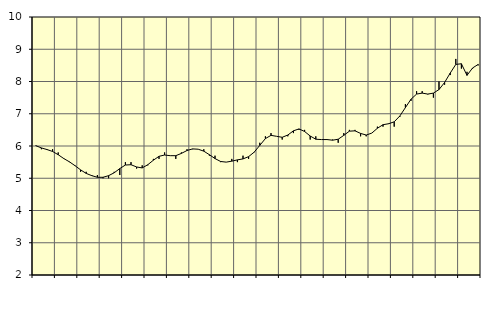
| Category | Piggar | Information och kommunikation, SNI 58-63 |
|---|---|---|
| nan | 6 | 6.01 |
| 1.0 | 5.9 | 5.94 |
| 1.0 | 5.9 | 5.89 |
| 1.0 | 5.9 | 5.83 |
| nan | 5.8 | 5.73 |
| 2.0 | 5.6 | 5.61 |
| 2.0 | 5.5 | 5.51 |
| 2.0 | 5.4 | 5.39 |
| nan | 5.2 | 5.26 |
| 3.0 | 5.2 | 5.15 |
| 3.0 | 5.1 | 5.08 |
| 3.0 | 5.1 | 5.03 |
| nan | 5 | 5.03 |
| 4.0 | 5 | 5.08 |
| 4.0 | 5.2 | 5.17 |
| 4.0 | 5.1 | 5.3 |
| nan | 5.5 | 5.41 |
| 5.0 | 5.5 | 5.42 |
| 5.0 | 5.3 | 5.35 |
| 5.0 | 5.4 | 5.32 |
| nan | 5.4 | 5.42 |
| 6.0 | 5.6 | 5.56 |
| 6.0 | 5.6 | 5.68 |
| 6.0 | 5.8 | 5.72 |
| nan | 5.7 | 5.7 |
| 7.0 | 5.6 | 5.7 |
| 7.0 | 5.8 | 5.77 |
| 7.0 | 5.9 | 5.86 |
| nan | 5.9 | 5.91 |
| 8.0 | 5.9 | 5.9 |
| 8.0 | 5.9 | 5.84 |
| 8.0 | 5.7 | 5.73 |
| nan | 5.7 | 5.61 |
| 9.0 | 5.5 | 5.52 |
| 9.0 | 5.5 | 5.5 |
| 9.0 | 5.6 | 5.53 |
| nan | 5.5 | 5.57 |
| 10.0 | 5.7 | 5.6 |
| 10.0 | 5.6 | 5.67 |
| 10.0 | 5.8 | 5.81 |
| nan | 6.1 | 6.02 |
| 11.0 | 6.3 | 6.23 |
| 11.0 | 6.4 | 6.33 |
| 11.0 | 6.3 | 6.3 |
| nan | 6.2 | 6.27 |
| 12.0 | 6.3 | 6.34 |
| 12.0 | 6.4 | 6.47 |
| 12.0 | 6.5 | 6.53 |
| nan | 6.5 | 6.45 |
| 13.0 | 6.2 | 6.31 |
| 13.0 | 6.3 | 6.21 |
| 13.0 | 6.2 | 6.2 |
| nan | 6.2 | 6.2 |
| 14.0 | 6.2 | 6.18 |
| 14.0 | 6.1 | 6.21 |
| 14.0 | 6.4 | 6.33 |
| nan | 6.5 | 6.46 |
| 15.0 | 6.5 | 6.47 |
| 15.0 | 6.3 | 6.39 |
| 15.0 | 6.3 | 6.34 |
| nan | 6.4 | 6.4 |
| 16.0 | 6.6 | 6.55 |
| 16.0 | 6.6 | 6.66 |
| 16.0 | 6.7 | 6.69 |
| nan | 6.6 | 6.75 |
| 17.0 | 6.9 | 6.93 |
| 17.0 | 7.3 | 7.19 |
| 17.0 | 7.4 | 7.45 |
| nan | 7.7 | 7.61 |
| 18.0 | 7.7 | 7.64 |
| 18.0 | 7.6 | 7.61 |
| 18.0 | 7.5 | 7.64 |
| nan | 8 | 7.75 |
| 19.0 | 7.9 | 7.97 |
| 19.0 | 8.2 | 8.26 |
| 19.0 | 8.7 | 8.53 |
| nan | 8.4 | 8.55 |
| 20.0 | 8.3 | 8.19 |
| 20.0 | 8.4 | 8.42 |
| 20.0 | 8.5 | 8.53 |